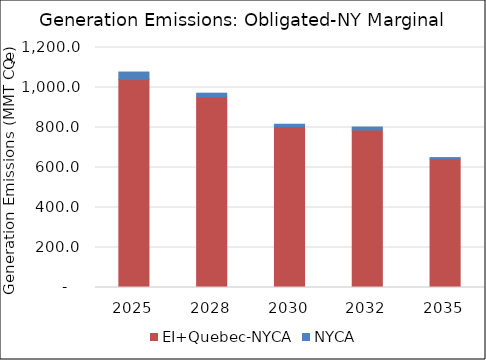
| Category | EI+Quebec-NYCA | NYCA |
|---|---|---|
| 2025.0 | 1039.57 | 37.77 |
| 2028.0 | 953.13 | 18.44 |
| 2030.0 | 803.88 | 12.97 |
| 2032.0 | 787.33 | 14.95 |
| 2035.0 | 642.86 | 6.73 |